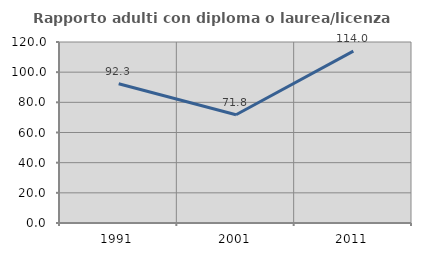
| Category | Rapporto adulti con diploma o laurea/licenza media  |
|---|---|
| 1991.0 | 92.308 |
| 2001.0 | 71.795 |
| 2011.0 | 113.953 |